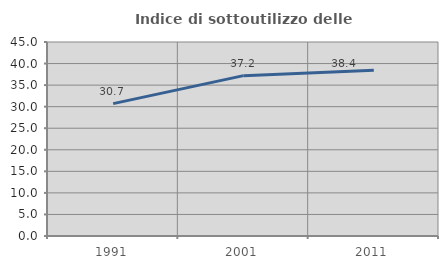
| Category | Indice di sottoutilizzo delle abitazioni  |
|---|---|
| 1991.0 | 30.713 |
| 2001.0 | 37.199 |
| 2011.0 | 38.427 |